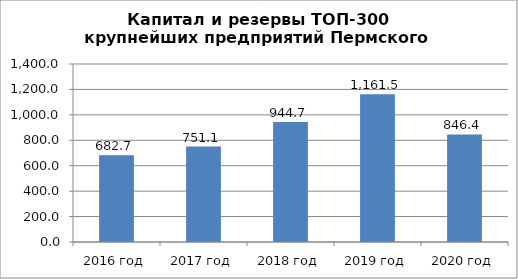
| Category | Капитал и резервы |
|---|---|
| 2016 год | 682.7 |
| 2017 год | 751.1 |
| 2018 год | 944.7 |
| 2019 год | 1161.5 |
| 2020 год | 846.4 |